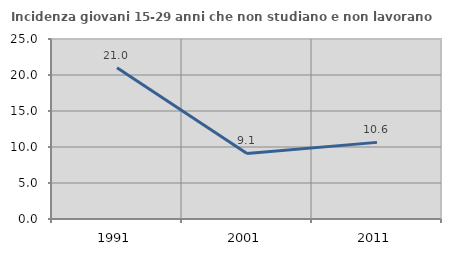
| Category | Incidenza giovani 15-29 anni che non studiano e non lavorano  |
|---|---|
| 1991.0 | 21.005 |
| 2001.0 | 9.104 |
| 2011.0 | 10.642 |